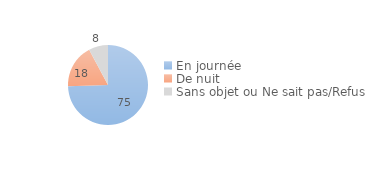
| Category | Series 0 |
|---|---|
| En journée | 74.511 |
| De nuit | 17.694 |
| Sans objet ou Ne sait pas/Refus | 7.795 |